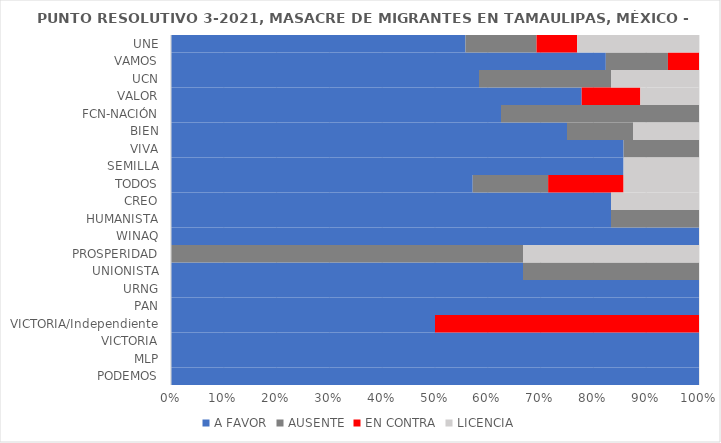
| Category | A FAVOR | AUSENTE | EN CONTRA | LICENCIA |
|---|---|---|---|---|
| UNE | 0.558 | 0.135 | 0.077 | 0.231 |
| VAMOS | 0.824 | 0.118 | 0.059 | 0 |
| UCN | 0.583 | 0.25 | 0 | 0.167 |
| VALOR | 0.778 | 0 | 0.111 | 0.111 |
| FCN-NACIÓN | 0.625 | 0.375 | 0 | 0 |
| BIEN | 0.75 | 0.125 | 0 | 0.125 |
| VIVA | 0.857 | 0.143 | 0 | 0 |
| SEMILLA | 0.857 | 0 | 0 | 0.143 |
| TODOS | 0.571 | 0.143 | 0.143 | 0.143 |
| CREO | 0.833 | 0 | 0 | 0.167 |
| HUMANISTA | 0.833 | 0.167 | 0 | 0 |
| WINAQ | 1 | 0 | 0 | 0 |
| PROSPERIDAD | 0 | 0.667 | 0 | 0.333 |
| UNIONISTA | 0.667 | 0.333 | 0 | 0 |
| URNG | 1 | 0 | 0 | 0 |
| PAN | 1 | 0 | 0 | 0 |
| VICTORIA/Independiente | 0.5 | 0 | 0.5 | 0 |
| VICTORIA | 1 | 0 | 0 | 0 |
| MLP | 1 | 0 | 0 | 0 |
| PODEMOS | 1 | 0 | 0 | 0 |